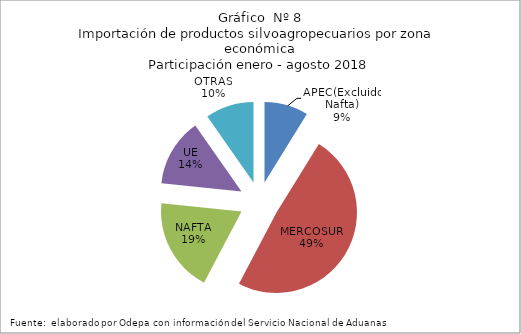
| Category | Series 0 |
|---|---|
| APEC(Excluido Nafta) | 386562.451 |
| MERCOSUR | 2142508.004 |
| NAFTA | 828921.039 |
| UE | 597780.657 |
| OTRAS | 426314.849 |